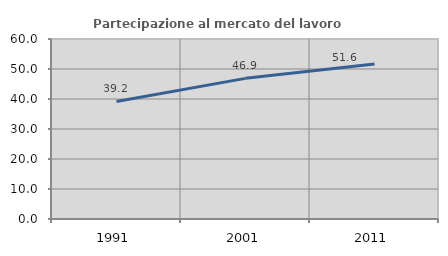
| Category | Partecipazione al mercato del lavoro  femminile |
|---|---|
| 1991.0 | 39.197 |
| 2001.0 | 46.88 |
| 2011.0 | 51.638 |